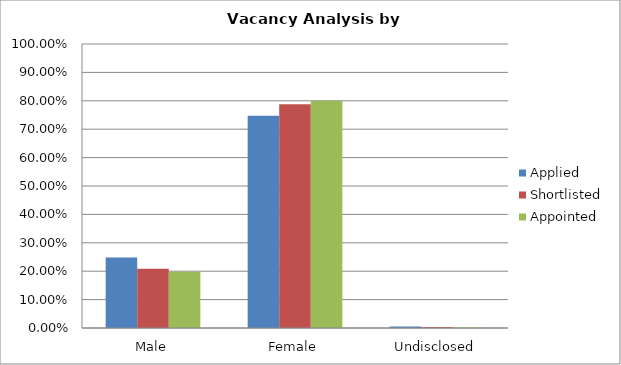
| Category | Applied | Shortlisted | Appointed |
|---|---|---|---|
| Male | 0.248 | 0.209 | 0.198 |
| Female | 0.747 | 0.788 | 0.8 |
| Undisclosed | 0.005 | 0.003 | 0.002 |